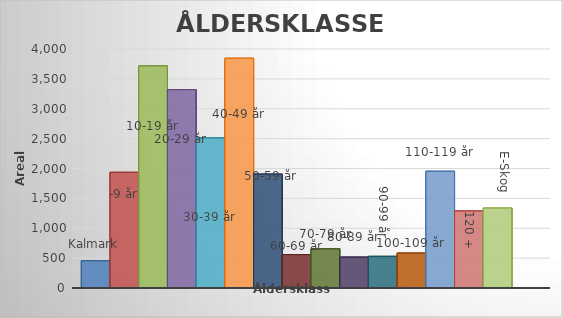
| Category | Series 0 | Series 1 | Series 2 | Series 3 | Series 4 | Series 5 | Series 6 | Series 7 | Series 8 | Series 9 | Series 10 | Series 11 | Series 12 | Series 13 | Series 14 | Series 15 |
|---|---|---|---|---|---|---|---|---|---|---|---|---|---|---|---|---|
| 0 | 455 | 1936 | 3717 | 3320 | 2512 | 3845 | 1906 | 559 | 656 | 517 | 530 | 584 | 1954 | 1290 | 1338 | 0 |